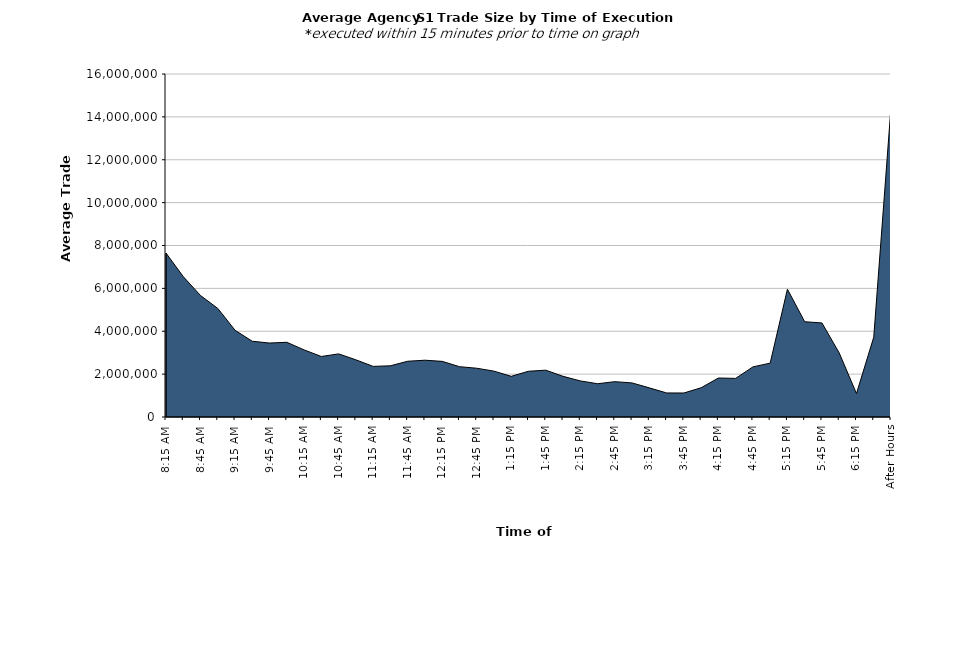
| Category | Series 0 |
|---|---|
| 8:15 AM | 7647563.845 |
| 8:30 AM | 6548641.508 |
| 8:45 AM | 5666845.316 |
| 9:00 AM | 5065228.264 |
| 9:15 AM | 4046353.713 |
| 9:30 AM | 3532536.348 |
| 9:45 AM | 3449777.442 |
| 10:00 AM | 3485753.905 |
| 10:15 AM | 3130883.174 |
| 10:30 AM | 2822716.149 |
| 10:45 AM | 2944048.113 |
| 11:00 AM | 2667404.411 |
| 11:15 AM | 2360800.462 |
| 11:30 AM | 2388150.605 |
| 11:45 AM | 2600226.156 |
| 12:00 PM | 2648729.473 |
| 12:15 PM | 2595023.136 |
| 12:30 PM | 2346971.455 |
| 12:45 PM | 2274805.868 |
| 1:00 PM | 2139681.509 |
| 1:15 PM | 1897125.566 |
| 1:30 PM | 2133656.123 |
| 1:45 PM | 2184270.063 |
| 2:00 PM | 1898382.839 |
| 2:15 PM | 1684040.851 |
| 2:30 PM | 1552272.215 |
| 2:45 PM | 1648514.797 |
| 3:00 PM | 1589560.182 |
| 3:15 PM | 1358888.442 |
| 3:30 PM | 1121737.191 |
| 3:45 PM | 1119409.653 |
| 4:00 PM | 1363815.796 |
| 4:15 PM | 1819062.024 |
| 4:30 PM | 1801308.579 |
| 4:45 PM | 2338084.177 |
| 5:00 PM | 2511722.934 |
| 5:15 PM | 5961914.125 |
| 5:30 PM | 4443951.901 |
| 5:45 PM | 4387162.739 |
| 6:00 PM | 2989487.218 |
| 6:15 PM | 1093871.693 |
| 6:30 PM | 3721998.944 |
| After Hours | 14466087.695 |